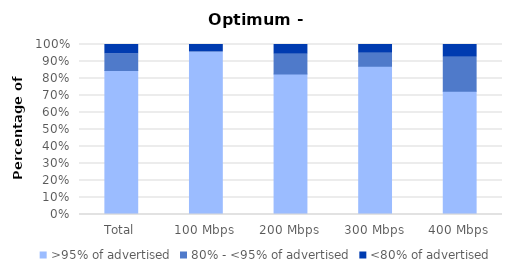
| Category | >95% of advertised | 80% - <95% of advertised | <80% of advertised |
|---|---|---|---|
| Total | 0.847 | 0.096 | 0.056 |
| 100 Mbps | 0.957 | 0 | 0.043 |
| 200 Mbps | 0.827 | 0.115 | 0.058 |
| 300 Mbps | 0.872 | 0.077 | 0.051 |
| 400 Mbps | 0.725 | 0.2 | 0.075 |